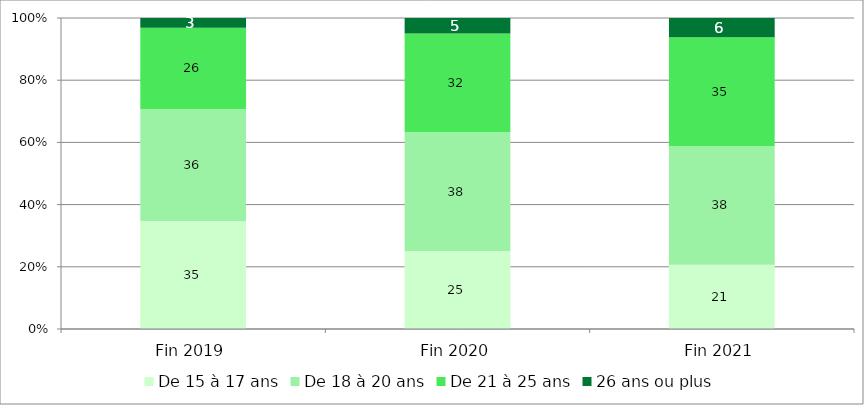
| Category | De 15 à 17 ans | De 18 à 20 ans | De 21 à 25 ans | 26 ans ou plus |
|---|---|---|---|---|
| Fin 2019 | 34.745 | 35.967 | 26.144 | 3.145 |
| Fin 2020 | 25.048 | 38.289 | 31.688 | 4.975 |
| Fin 2021 | 20.643 | 38.209 | 34.94 | 6.207 |